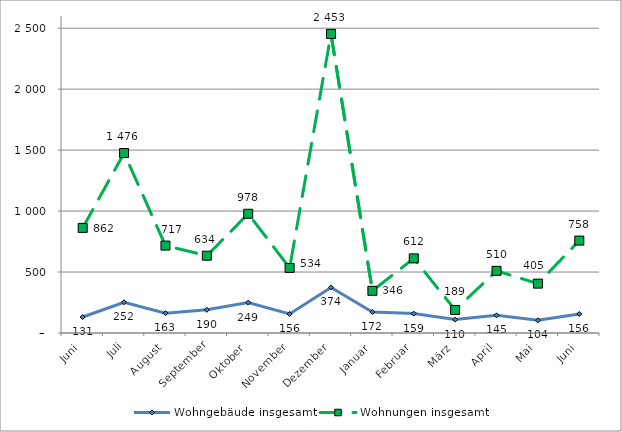
| Category | Wohngebäude insgesamt | Wohnungen insgesamt |
|---|---|---|
| Juni | 131 | 862 |
| Juli | 252 | 1476 |
| August | 163 | 717 |
| September | 190 | 634 |
| Oktober | 249 | 978 |
| November | 156 | 534 |
| Dezember | 374 | 2453 |
| Januar | 172 | 346 |
| Februar | 159 | 612 |
| März | 110 | 189 |
| April | 145 | 510 |
| Mai | 104 | 405 |
| Juni | 156 | 758 |